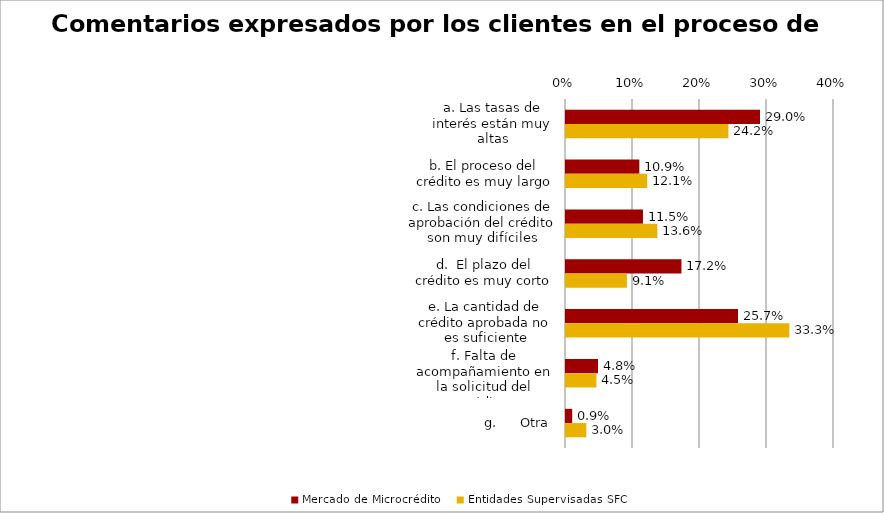
| Category | Mercado de Microcrédito | Entidades Supervisadas SFC |
|---|---|---|
| a. Las tasas de interés están muy altas | 0.29 | 0.242 |
| b. El proceso del crédito es muy largo | 0.109 | 0.121 |
| c. Las condiciones de aprobación del crédito son muy difíciles | 0.115 | 0.136 |
| d.  El plazo del crédito es muy corto | 0.172 | 0.091 |
| e. La cantidad de crédito aprobada no es suficiente | 0.257 | 0.333 |
| f. Falta de acompañamiento en la solicitud del crédito | 0.048 | 0.045 |
| g.      Otra | 0.009 | 0.03 |